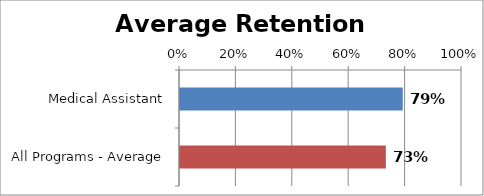
| Category | RetentionRate |
|---|---|
| Medical Assistant | 0.79 |
| All Programs - Average | 0.73 |